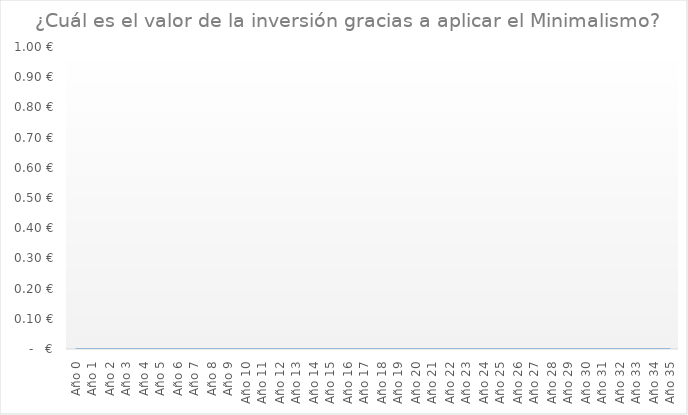
| Category | Series 0 |
|---|---|
| Año 0 | 0 |
| Año 1 | 0 |
| Año 2 | 0 |
| Año 3 | 0 |
| Año 4 | 0 |
| Año 5 | 0 |
| Año 6 | 0 |
| Año 7 | 0 |
| Año 8 | 0 |
| Año 9 | 0 |
| Año 10 | 0 |
| Año 11 | 0 |
| Año 12 | 0 |
| Año 13 | 0 |
| Año 14 | 0 |
| Año 15 | 0 |
| Año 16 | 0 |
| Año 17 | 0 |
| Año 18 | 0 |
| Año 19 | 0 |
| Año 20 | 0 |
| Año 21 | 0 |
| Año 22 | 0 |
| Año 23 | 0 |
| Año 24 | 0 |
| Año 25 | 0 |
| Año 26 | 0 |
| Año 27 | 0 |
| Año 28 | 0 |
| Año 29 | 0 |
| Año 30 | 0 |
| Año 31 | 0 |
| Año 32 | 0 |
| Año 33 | 0 |
| Año 34 | 0 |
| Año 35 | 0 |